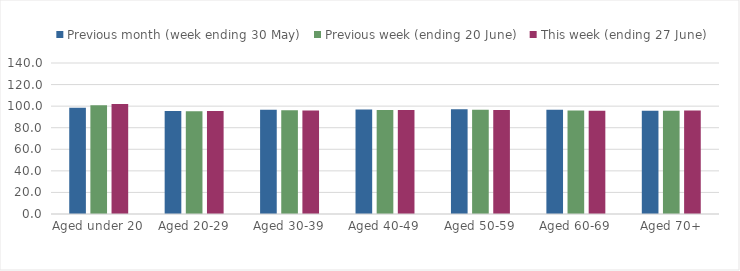
| Category | Previous month (week ending 30 May) | Previous week (ending 20 June) | This week (ending 27 June) |
|---|---|---|---|
| Aged under 20 | 98.577 | 100.82 | 101.883 |
| Aged 20-29 | 95.504 | 95.303 | 95.454 |
| Aged 30-39 | 96.75 | 96.131 | 96.045 |
| Aged 40-49 | 96.813 | 96.419 | 96.364 |
| Aged 50-59 | 97.132 | 96.57 | 96.499 |
| Aged 60-69 | 96.583 | 95.945 | 95.614 |
| Aged 70+ | 95.765 | 95.765 | 96.052 |